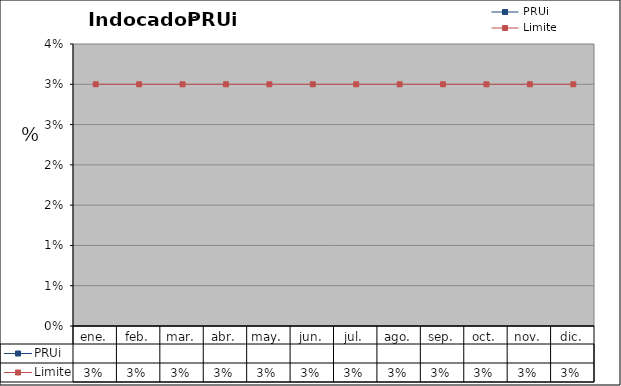
| Category | PRUi | Limite |
|---|---|---|
| ene. |  | 0.03 |
| feb. |  | 0.03 |
| mar. |  | 0.03 |
| abr. |  | 0.03 |
| may. |  | 0.03 |
| jun. |  | 0.03 |
| jul. |  | 0.03 |
| ago. |  | 0.03 |
| sep. |  | 0.03 |
| oct. |  | 0.03 |
| nov. |  | 0.03 |
| dic. |  | 0.03 |